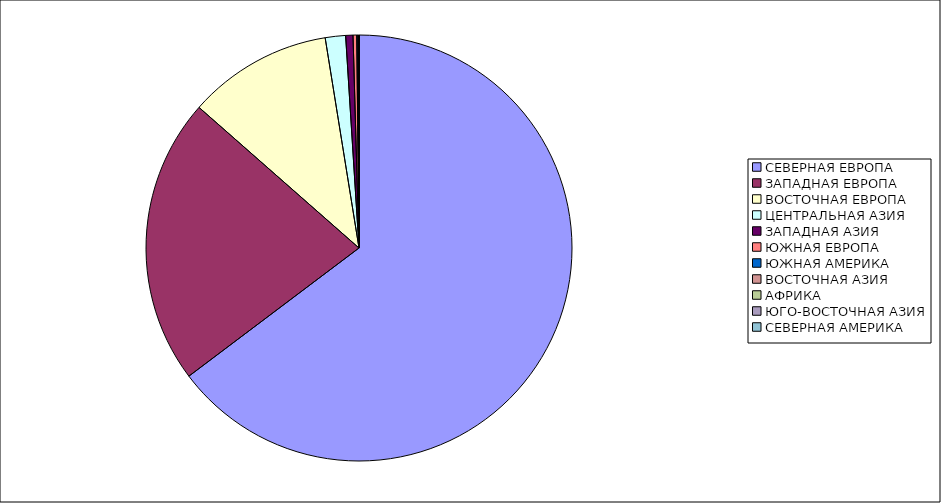
| Category | Оборот |
|---|---|
| СЕВЕРНАЯ ЕВРОПА | 64.723 |
| ЗАПАДНАЯ ЕВРОПА | 21.752 |
| ВОСТОЧНАЯ ЕВРОПА | 10.984 |
| ЦЕНТРАЛЬНАЯ АЗИЯ | 1.54 |
| ЗАПАДНАЯ АЗИЯ | 0.554 |
| ЮЖНАЯ ЕВРОПА | 0.28 |
| ЮЖНАЯ АМЕРИКА | 0.084 |
| ВОСТОЧНАЯ АЗИЯ | 0.057 |
| АФРИКА | 0.024 |
| ЮГО-ВОСТОЧНАЯ АЗИЯ | 0.002 |
| СЕВЕРНАЯ АМЕРИКА | 0 |